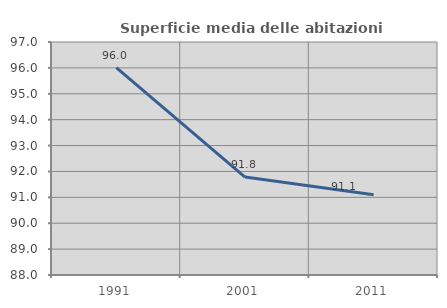
| Category | Superficie media delle abitazioni occupate |
|---|---|
| 1991.0 | 96.006 |
| 2001.0 | 91.782 |
| 2011.0 | 91.096 |